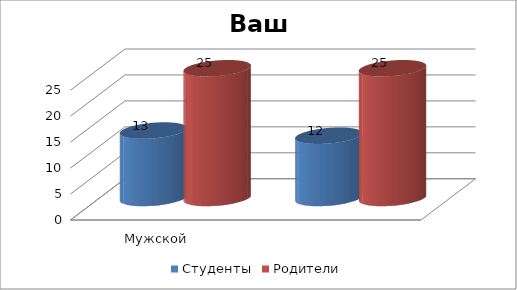
| Category | Студенты | Родители |
|---|---|---|
| Мужской | 13 | 25 |